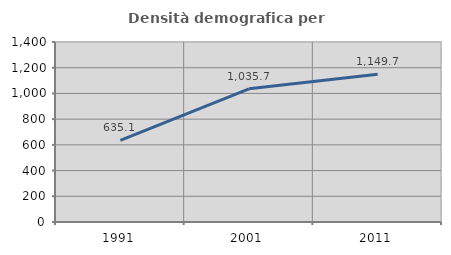
| Category | Densità demografica |
|---|---|
| 1991.0 | 635.101 |
| 2001.0 | 1035.664 |
| 2011.0 | 1149.736 |